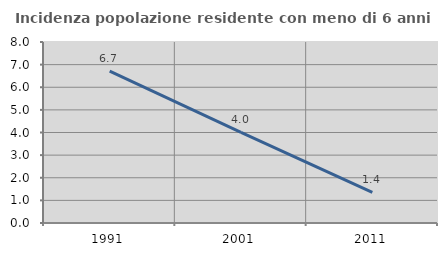
| Category | Incidenza popolazione residente con meno di 6 anni |
|---|---|
| 1991.0 | 6.709 |
| 2001.0 | 4.006 |
| 2011.0 | 1.352 |